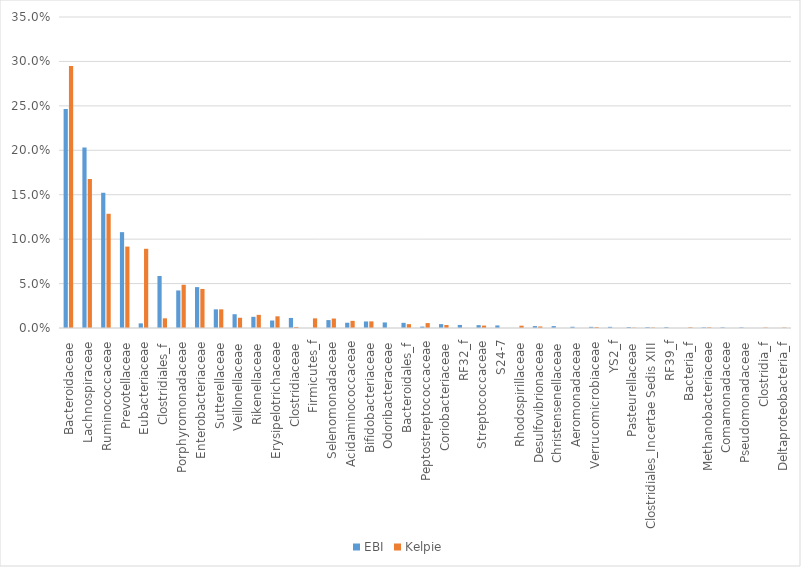
| Category | EBI | Kelpie |
|---|---|---|
| Bacteroidaceae | 0.247 | 0.295 |
| Lachnospiraceae | 0.203 | 0.168 |
| Ruminococcaceae | 0.152 | 0.129 |
| Prevotellaceae | 0.108 | 0.092 |
| Eubacteriaceae | 0.005 | 0.089 |
| Clostridiales_f | 0.059 | 0.011 |
| Porphyromonadaceae | 0.042 | 0.049 |
| Enterobacteriaceae | 0.046 | 0.044 |
| Sutterellaceae | 0.021 | 0.021 |
| Veillonellaceae | 0.016 | 0.012 |
| Rikenellaceae | 0.013 | 0.015 |
| Erysipelotrichaceae | 0.008 | 0.013 |
| Clostridiaceae | 0.011 | 0.001 |
| Firmicutes_f | 0 | 0.011 |
| Selenomonadaceae | 0.009 | 0.011 |
| Acidaminococcaceae | 0.006 | 0.008 |
| Bifidobacteriaceae | 0.007 | 0.007 |
| Odoribacteraceae | 0.006 | 0 |
| Bacteroidales_f | 0.006 | 0.004 |
| Peptostreptococcaceae | 0.002 | 0.006 |
| Coriobacteriaceae | 0.004 | 0.003 |
| RF32_f | 0.003 | 0 |
| Streptococcaceae | 0.003 | 0.003 |
| S24-7 | 0.003 | 0 |
| Rhodospirillaceae | 0 | 0.003 |
| Desulfovibrionaceae | 0.002 | 0.002 |
| Christensenellaceae | 0.002 | 0 |
| Aeromonadaceae | 0.001 | 0 |
| Verrucomicrobiaceae | 0.001 | 0.001 |
| YS2_f | 0.001 | 0 |
| Pasteurellaceae | 0.001 | 0 |
| Clostridiales_Incertae Sedis XIII | 0.001 | 0.001 |
| RF39_f | 0.001 | 0 |
| Bacteria_f | 0 | 0.001 |
| Methanobacteriaceae | 0.001 | 0.001 |
| Comamonadaceae | 0.001 | 0 |
| Pseudomonadaceae | 0.001 | 0 |
| Clostridia_f | 0 | 0.001 |
| Deltaproteobacteria_f | 0 | 0.001 |